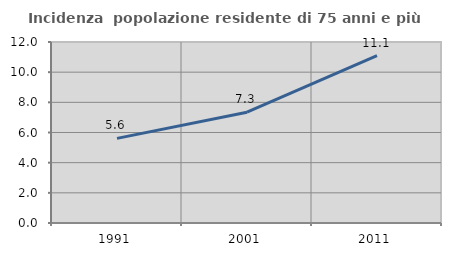
| Category | Incidenza  popolazione residente di 75 anni e più |
|---|---|
| 1991.0 | 5.611 |
| 2001.0 | 7.345 |
| 2011.0 | 11.102 |